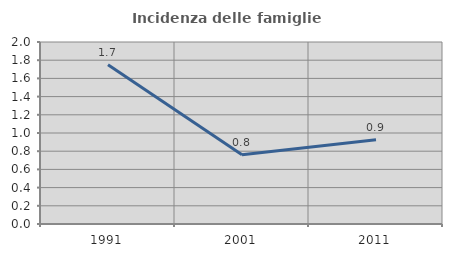
| Category | Incidenza delle famiglie numerose |
|---|---|
| 1991.0 | 1.75 |
| 2001.0 | 0.76 |
| 2011.0 | 0.927 |